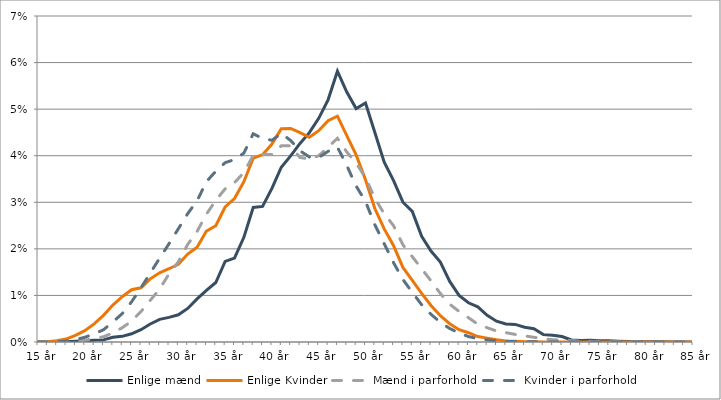
| Category | Enlige mænd | Enlige Kvinder | Mænd i parforhold  | Kvinder i parforhold |
|---|---|---|---|---|
|   15 år | 0 | 0 | 0 | 0 |
|   16 år | 0 | 0 | 0 | 0 |
|   17 år | 0 | 0 | 0 | 0 |
|   18 år | 0 | 0.001 | 0 | 0 |
|   19 år | 0 | 0.001 | 0 | 0.001 |
|   20 år | 0 | 0.002 | 0 | 0.001 |
|   21 år | 0 | 0.004 | 0.001 | 0.002 |
|   22 år | 0 | 0.006 | 0.001 | 0.003 |
|   23 år | 0.001 | 0.008 | 0.002 | 0.004 |
|   24 år | 0.001 | 0.01 | 0.003 | 0.006 |
|   25 år | 0.002 | 0.011 | 0.004 | 0.009 |
|   26 år | 0.003 | 0.012 | 0.007 | 0.012 |
|   27 år | 0.004 | 0.014 | 0.009 | 0.015 |
|   28 år | 0.005 | 0.015 | 0.011 | 0.018 |
|   29 år | 0.005 | 0.016 | 0.015 | 0.021 |
|   30 år | 0.006 | 0.017 | 0.017 | 0.024 |
|   31 år | 0.007 | 0.019 | 0.021 | 0.028 |
|   32 år | 0.009 | 0.02 | 0.024 | 0.03 |
|   33 år | 0.011 | 0.024 | 0.027 | 0.034 |
|   34 år | 0.013 | 0.025 | 0.03 | 0.037 |
|   35 år | 0.017 | 0.029 | 0.033 | 0.038 |
|   36 år | 0.018 | 0.031 | 0.034 | 0.039 |
|   37 år | 0.022 | 0.034 | 0.036 | 0.041 |
|   38 år | 0.029 | 0.039 | 0.04 | 0.045 |
|   39 år | 0.029 | 0.04 | 0.04 | 0.044 |
|   40 år | 0.033 | 0.042 | 0.04 | 0.043 |
|   41 år | 0.038 | 0.046 | 0.042 | 0.045 |
|   42 år | 0.04 | 0.046 | 0.042 | 0.043 |
|   43 år | 0.043 | 0.045 | 0.04 | 0.041 |
|   44 år | 0.045 | 0.044 | 0.039 | 0.04 |
|   45 år | 0.048 | 0.045 | 0.04 | 0.04 |
|   46 år | 0.052 | 0.048 | 0.042 | 0.041 |
|   47 år | 0.058 | 0.048 | 0.044 | 0.042 |
|   48 år | 0.054 | 0.044 | 0.041 | 0.038 |
|   49 år | 0.05 | 0.04 | 0.038 | 0.033 |
|   50 år | 0.051 | 0.035 | 0.035 | 0.03 |
|   51 år | 0.045 | 0.029 | 0.031 | 0.025 |
|   52 år | 0.039 | 0.024 | 0.028 | 0.021 |
|   53 år | 0.035 | 0.021 | 0.025 | 0.017 |
|   54 år | 0.03 | 0.016 | 0.021 | 0.013 |
|   55 år | 0.028 | 0.013 | 0.018 | 0.011 |
|   56 år | 0.023 | 0.01 | 0.016 | 0.008 |
|   57 år | 0.02 | 0.008 | 0.013 | 0.006 |
|   58 år | 0.017 | 0.006 | 0.01 | 0.004 |
|   59 år | 0.013 | 0.004 | 0.008 | 0.003 |
|   60 år | 0.01 | 0.003 | 0.007 | 0.002 |
|   61 år | 0.008 | 0.002 | 0.005 | 0.001 |
|   62 år | 0.008 | 0.001 | 0.004 | 0.001 |
|   63 år | 0.006 | 0.001 | 0.003 | 0 |
|   64 år | 0.004 | 0 | 0.002 | 0 |
|   65 år | 0.004 | 0 | 0.002 | 0 |
|   66 år | 0.004 | 0 | 0.002 | 0 |
|   67 år | 0.003 | 0 | 0.001 | 0 |
|   68 år | 0.003 | 0 | 0.001 | 0 |
|   69 år | 0.002 | 0 | 0.001 | 0 |
|   70 år | 0.001 | 0 | 0 | 0 |
|   71 år | 0.001 | 0 | 0 | 0 |
|   72 år | 0 | 0 | 0 | 0 |
|   73 år | 0 | 0 | 0 | 0 |
|   74 år | 0 | 0 | 0 | 0 |
|   75 år | 0 | 0 | 0 | 0 |
|   76 år | 0 | 0 | 0 | 0 |
|   77 år | 0 | 0 | 0 | 0 |
|   78 år | 0 | 0 | 0 | 0 |
|   79 år | 0 | 0 | 0 | 0 |
|   80 år | 0 | 0 | 0 | 0 |
|   81 år | 0 | 0 | 0 | 0 |
|   82 år | 0 | 0 | 0 | 0 |
|   83 år | 0 | 0 | 0 | 0 |
|   84 år | 0 | 0 | 0 | 0 |
|   85 år | 0 | 0 | 0 | 0 |